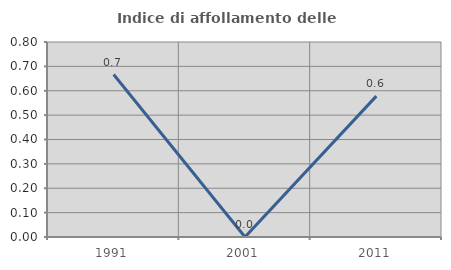
| Category | Indice di affollamento delle abitazioni  |
|---|---|
| 1991.0 | 0.667 |
| 2001.0 | 0 |
| 2011.0 | 0.578 |